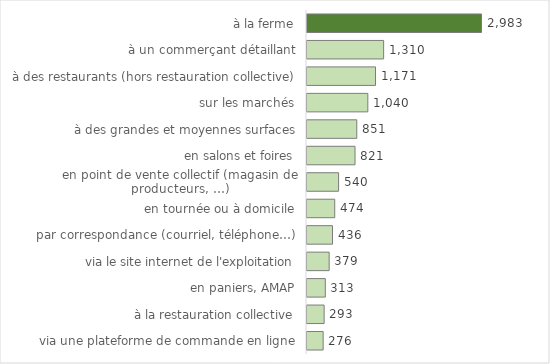
| Category | Effectif |
|---|---|
| à la ferme | 2983 |
| à un commerçant détaillant | 1310 |
| à des restaurants (hors restauration collective) | 1171 |
| sur les marchés | 1040 |
| à des grandes et moyennes surfaces | 851 |
| en salons et foires | 821 |
| en point de vente collectif (magasin de producteurs, …) | 540 |
| en tournée ou à domicile | 474 |
| par correspondance (courriel, téléphone…) | 436 |
|  via le site internet de l'exploitation | 379 |
|  en paniers, AMAP | 313 |
| à la restauration collective | 293 |
|  via une plateforme de commande en ligne | 276 |